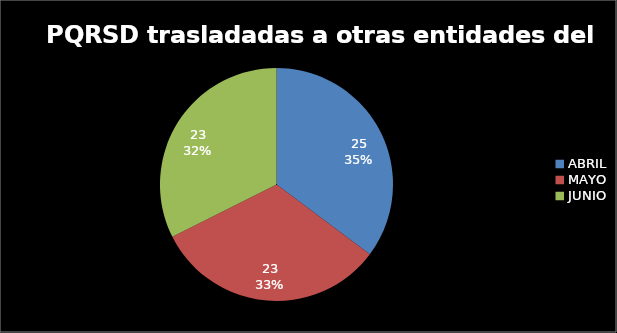
| Category |  PQRSD atendidas al interior del Congreso |
|---|---|
| ABRIL | 25 |
| MAYO | 23 |
| JUNIO | 23 |